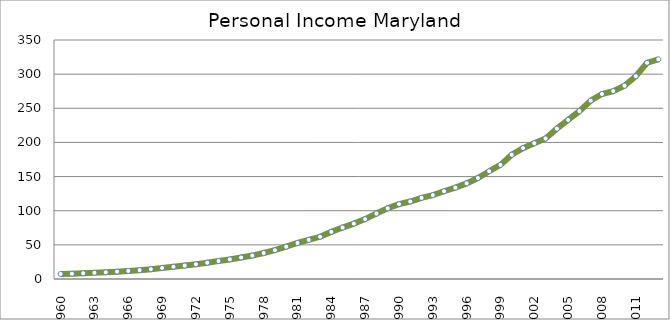
| Category | Series 0 |
|---|---|
| 1960.0 | 7.312 |
| 1961.0 | 7.771 |
| 1962.0 | 8.403 |
| 1963.0 | 8.997 |
| 1964.0 | 9.822 |
| 1965.0 | 10.727 |
| 1966.0 | 11.841 |
| 1967.0 | 12.913 |
| 1968.0 | 14.305 |
| 1969.0 | 16.23 |
| 1970.0 | 17.951 |
| 1971.0 | 19.64 |
| 1972.0 | 21.555 |
| 1973.0 | 23.861 |
| 1974.0 | 26.329 |
| 1975.0 | 28.656 |
| 1976.0 | 31.444 |
| 1977.0 | 34.306 |
| 1978.0 | 38.027 |
| 1979.0 | 42.135 |
| 1980.0 | 47.296 |
| 1981.0 | 52.794 |
| 1982.0 | 57.33 |
| 1983.0 | 61.841 |
| 1984.0 | 68.984 |
| 1985.0 | 75.325 |
| 1986.0 | 81.069 |
| 1987.0 | 87.696 |
| 1988.0 | 95.867 |
| 1989.0 | 103.528 |
| 1990.0 | 109.686 |
| 1991.0 | 113.436 |
| 1992.0 | 118.847 |
| 1993.0 | 122.906 |
| 1994.0 | 128.523 |
| 1995.0 | 133.814 |
| 1996.0 | 140.035 |
| 1997.0 | 147.843 |
| 1998.0 | 157.784 |
| 1999.0 | 167.075 |
| 2000.0 | 181.957 |
| 2001.0 | 191.657 |
| 2002.0 | 198.824 |
| 2003.0 | 205.737 |
| 2004.0 | 220.127 |
| 2005.0 | 232.95 |
| 2006.0 | 245.879 |
| 2007.0 | 261.115 |
| 2008.0 | 270.924 |
| 2009.0 | 275.143 |
| 2010.0 | 283.05 |
| 2011.0 | 296.957 |
| 2012.0 | 316.681 |
| 2013.0 | 321.689 |